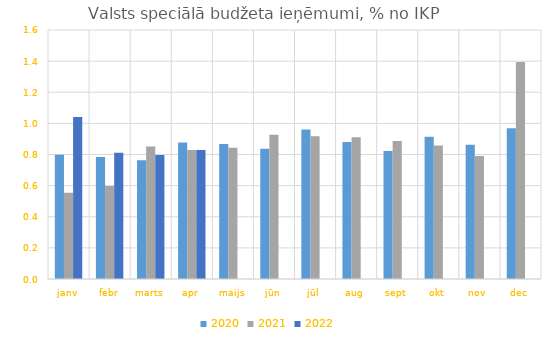
| Category | 2020 | 2021 | 2022 |
|---|---|---|---|
| janv | 0.798 | 0.554 | 1.042 |
| febr | 0.784 | 0.598 | 0.812 |
| marts | 0.763 | 0.851 | 0.796 |
| apr | 0.877 | 0.829 | 0.828 |
| maijs | 0.868 | 0.843 | 0 |
| jūn | 0.838 | 0.927 | 0 |
| jūl | 0.961 | 0.918 | 0 |
| aug | 0.88 | 0.911 | 0 |
| sept | 0.822 | 0.887 | 0 |
| okt | 0.913 | 0.858 | 0 |
| nov | 0.863 | 0.79 | 0 |
| dec | 0.969 | 1.394 | 0 |